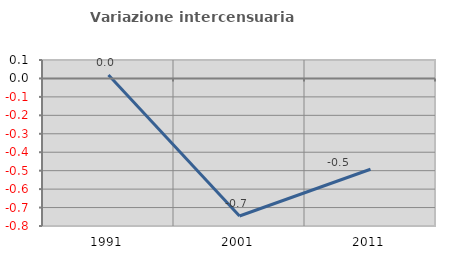
| Category | Variazione intercensuaria annua |
|---|---|
| 1991.0 | 0.018 |
| 2001.0 | -0.746 |
| 2011.0 | -0.492 |